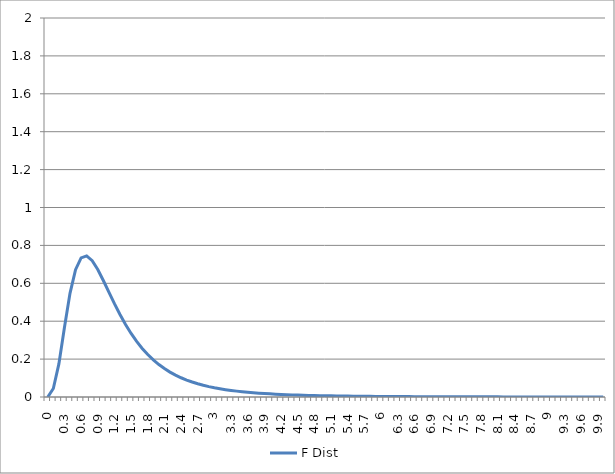
| Category | F Dist |
|---|---|
| 0.0 | 0 |
| 0.1 | 0.045 |
| 0.2 | 0.174 |
| 0.3 | 0.367 |
| 0.4 | 0.547 |
| 0.5 | 0.672 |
| 0.6 | 0.734 |
| 0.7 | 0.744 |
| 0.8 | 0.719 |
| 0.9 | 0.672 |
| 1.0 | 0.615 |
| 1.1 | 0.553 |
| 1.2 | 0.492 |
| 1.3 | 0.435 |
| 1.4 | 0.383 |
| 1.5 | 0.335 |
| 1.6 | 0.293 |
| 1.7 | 0.256 |
| 1.8 | 0.224 |
| 1.9 | 0.196 |
| 2.0 | 0.171 |
| 2.1 | 0.15 |
| 2.2 | 0.131 |
| 2.3 | 0.115 |
| 2.4 | 0.102 |
| 2.5 | 0.089 |
| 2.6 | 0.079 |
| 2.7 | 0.07 |
| 2.8 | 0.062 |
| 2.9 | 0.055 |
| 3.0 | 0.049 |
| 3.1 | 0.043 |
| 3.2 | 0.039 |
| 3.3 | 0.035 |
| 3.4 | 0.031 |
| 3.5 | 0.028 |
| 3.6 | 0.025 |
| 3.7 | 0.022 |
| 3.8 | 0.02 |
| 3.9 | 0.018 |
| 4.0 | 0.017 |
| 4.1 | 0.015 |
| 4.2 | 0.014 |
| 4.3 | 0.012 |
| 4.4 | 0.011 |
| 4.5 | 0.01 |
| 4.6 | 0.009 |
| 4.7 | 0.009 |
| 4.8 | 0.008 |
| 4.9 | 0.007 |
| 5.0 | 0.007 |
| 5.1 | 0.006 |
| 5.2 | 0.005 |
| 5.3 | 0.005 |
| 5.4 | 0.005 |
| 5.5 | 0.004 |
| 5.6 | 0.004 |
| 5.7 | 0.004 |
| 5.8 | 0.003 |
| 5.9 | 0.003 |
| 6.0 | 0.003 |
| 6.1 | 0.003 |
| 6.2 | 0.002 |
| 6.3 | 0.002 |
| 6.4 | 0.002 |
| 6.5 | 0.002 |
| 6.6 | 0.002 |
| 6.7 | 0.002 |
| 6.8 | 0.002 |
| 6.9 | 0.002 |
| 7.0 | 0.001 |
| 7.1 | 0.001 |
| 7.2 | 0.001 |
| 7.3 | 0.001 |
| 7.4 | 0.001 |
| 7.5 | 0.001 |
| 7.6 | 0.001 |
| 7.7 | 0.001 |
| 7.8 | 0.001 |
| 7.9 | 0.001 |
| 8.0 | 0.001 |
| 8.1 | 0.001 |
| 8.2 | 0.001 |
| 8.3 | 0.001 |
| 8.4 | 0.001 |
| 8.5 | 0.001 |
| 8.6 | 0.001 |
| 8.7 | 0 |
| 8.8 | 0 |
| 8.9 | 0 |
| 9.0 | 0 |
| 9.1 | 0 |
| 9.2 | 0 |
| 9.3 | 0 |
| 9.4 | 0 |
| 9.5 | 0 |
| 9.6 | 0 |
| 9.7 | 0 |
| 9.8 | 0 |
| 9.9 | 0 |
| 10.0 | 0 |